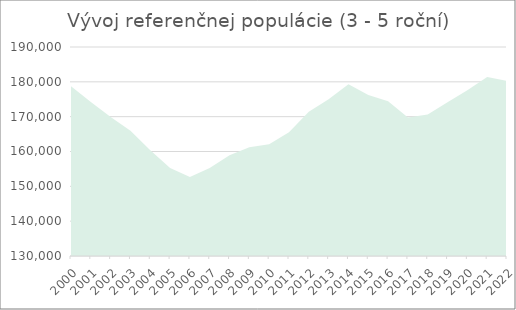
| Category | P 3-5 roční |
|---|---|
| 2000.0 | 178717 |
| 2001.0 | 174198 |
| 2002.0 | 169888 |
| 2003.0 | 165959 |
| 2004.0 | 160359 |
| 2005.0 | 155230 |
| 2006.0 | 152669 |
| 2007.0 | 155257 |
| 2008.0 | 158942 |
| 2009.0 | 161220 |
| 2010.0 | 162082 |
| 2011.0 | 165524 |
| 2012.0 | 171410 |
| 2013.0 | 174972 |
| 2014.0 | 179292 |
| 2015.0 | 176217 |
| 2016.0 | 174448 |
| 2017.0 | 169783 |
| 2018.0 | 170605 |
| 2019.0 | 174137 |
| 2020.0 | 177619 |
| 2021.0 | 181364 |
| 2022.0 | 180291 |